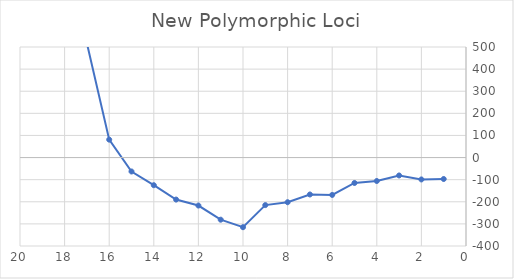
| Category | Series 0 |
|---|---|
| 0 | -97 |
| 1 | -99 |
| 2 | -81 |
| 3 | -106 |
| 4 | -115 |
| 5 | -169 |
| 6 | -167 |
| 7 | -202 |
| 8 | -215 |
| 9 | -315 |
| 10 | -281 |
| 11 | -217 |
| 12 | -190 |
| 13 | -125 |
| 14 | -63 |
| 15 | 81 |
| 16 | 517 |
| 17 | 1384 |